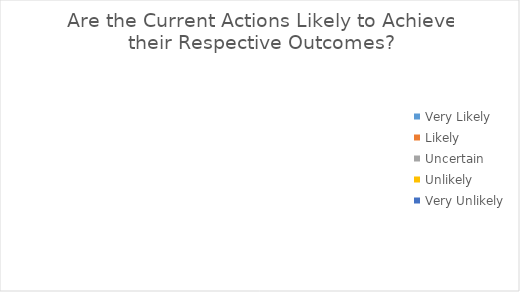
| Category | Series 0 |
|---|---|
| Very Likely | 0 |
| Likely | 0 |
| Uncertain | 0 |
| Unlikely | 0 |
| Very Unlikely | 0 |